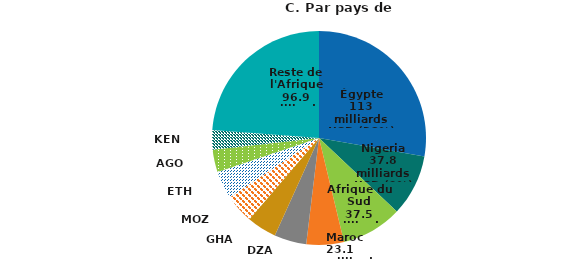
| Category | Total 2017-22 |
|---|---|
| Égypte | 113.039 |
| Nigéria | 37.8 |
| Afrique du Sud | 37.465 |
| Maroc | 23.078 |
| DZA | 19.811 |
| GHA | 18.326 |
| MOZ | 17.875 |
| ETH | 17.027 |
| AGO | 13.869 |
| KEN | 12.044 |
| Reste de l'Afrique | 96.881 |